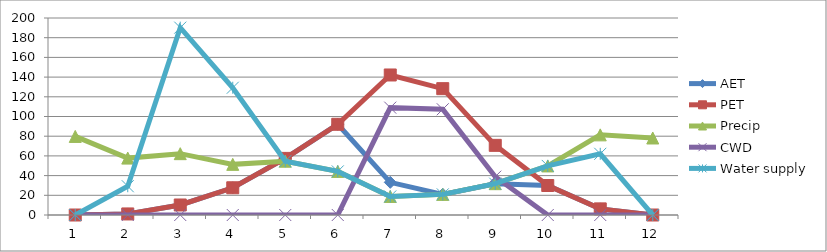
| Category | AET | PET | Precip | CWD | Water supply |
|---|---|---|---|---|---|
| 1.0 | 0 | 0 | 79.765 | 0 | 0 |
| 2.0 | 1.079 | 1.079 | 57.77 | 0 | 29.213 |
| 3.0 | 10.165 | 10.165 | 62.275 | 0 | 190.209 |
| 4.0 | 27.637 | 27.637 | 51.41 | 0 | 129.198 |
| 5.0 | 57.466 | 57.466 | 54.59 | 0 | 54.59 |
| 6.0 | 92.1 | 92.1 | 44.255 | 0 | 44.255 |
| 7.0 | 33.171 | 142.15 | 18.815 | 108.979 | 18.815 |
| 8.0 | 20.935 | 128.265 | 20.935 | 107.33 | 20.935 |
| 9.0 | 31.8 | 70.714 | 31.8 | 38.914 | 31.8 |
| 10.0 | 29.945 | 29.945 | 49.82 | 0 | 49.82 |
| 11.0 | 6.214 | 6.214 | 81.355 | 0 | 62.13 |
| 12.0 | 0 | 0 | 78.175 | 0 | 0 |